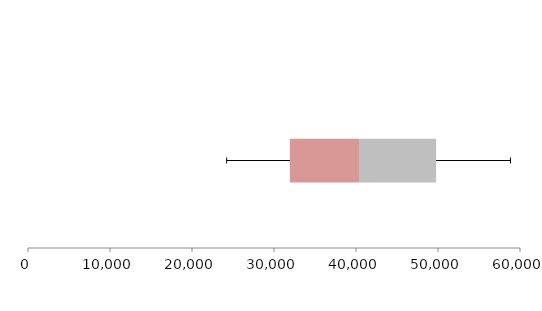
| Category | Series 1 | Series 2 | Series 3 |
|---|---|---|---|
| 0 | 31932.793 | 8431.614 | 9409.072 |